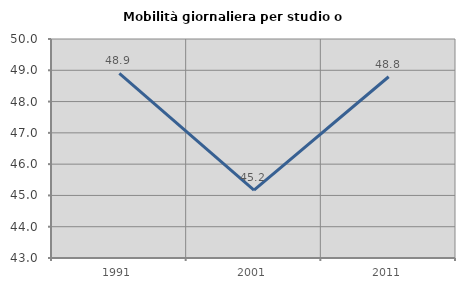
| Category | Mobilità giornaliera per studio o lavoro |
|---|---|
| 1991.0 | 48.9 |
| 2001.0 | 45.172 |
| 2011.0 | 48.794 |